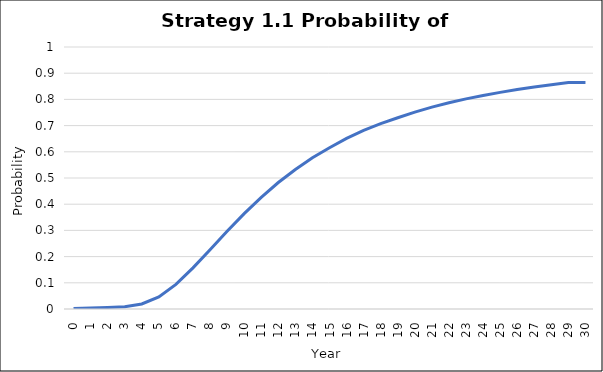
| Category | Series 0 |
|---|---|
| 0.0 | 0.002 |
| 1.0 | 0.004 |
| 2.0 | 0.006 |
| 3.0 | 0.008 |
| 4.0 | 0.019 |
| 5.0 | 0.046 |
| 6.0 | 0.094 |
| 7.0 | 0.157 |
| 8.0 | 0.226 |
| 9.0 | 0.297 |
| 10.0 | 0.364 |
| 11.0 | 0.426 |
| 12.0 | 0.483 |
| 13.0 | 0.533 |
| 14.0 | 0.578 |
| 15.0 | 0.616 |
| 16.0 | 0.651 |
| 17.0 | 0.682 |
| 18.0 | 0.707 |
| 19.0 | 0.73 |
| 20.0 | 0.751 |
| 21.0 | 0.771 |
| 22.0 | 0.787 |
| 23.0 | 0.802 |
| 24.0 | 0.815 |
| 25.0 | 0.827 |
| 26.0 | 0.838 |
| 27.0 | 0.848 |
| 28.0 | 0.856 |
| 29.0 | 0.864 |
| 30.0 | 0.864 |